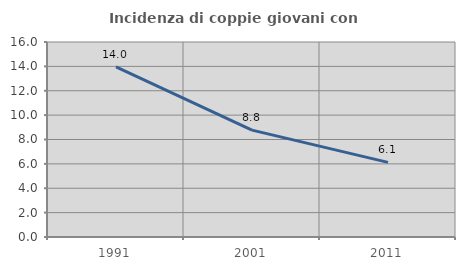
| Category | Incidenza di coppie giovani con figli |
|---|---|
| 1991.0 | 13.953 |
| 2001.0 | 8.768 |
| 2011.0 | 6.122 |